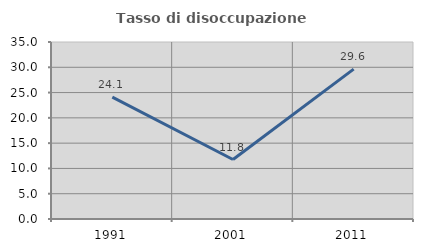
| Category | Tasso di disoccupazione giovanile  |
|---|---|
| 1991.0 | 24.107 |
| 2001.0 | 11.765 |
| 2011.0 | 29.63 |